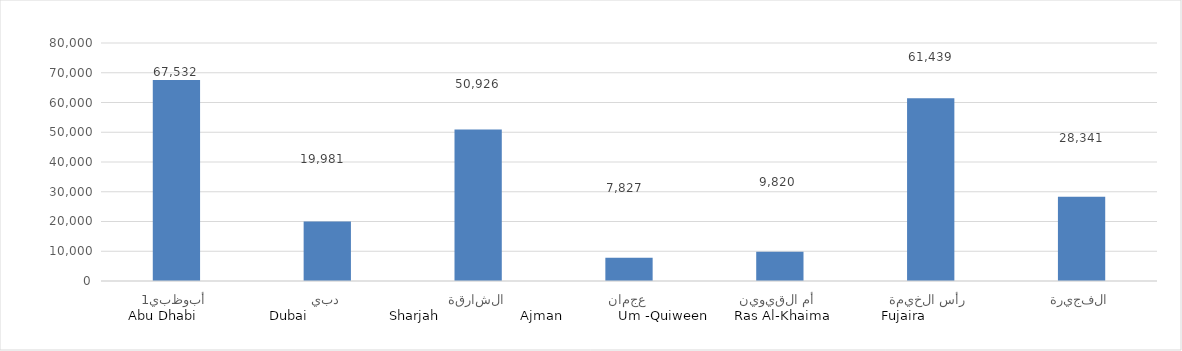
| Category | المساحة المحصولية |
|---|---|
| أبوظبي1 | 67532 |
| دبي | 19981.101 |
| الشارقة | 50926.069 |
| عجمان | 7827.319 |
| أم القيوين | 9820.109 |
| رأس الخيمة | 61439.255 |
| الفجيرة | 28340.681 |